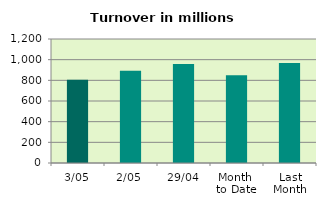
| Category | Series 0 |
|---|---|
| 3/05 | 806.55 |
| 2/05 | 891.706 |
| 29/04 | 958.055 |
| Month 
to Date | 849.128 |
| Last
Month | 968.247 |